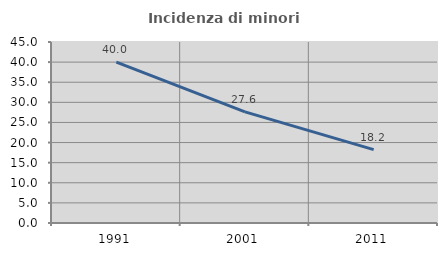
| Category | Incidenza di minori stranieri |
|---|---|
| 1991.0 | 40 |
| 2001.0 | 27.632 |
| 2011.0 | 18.235 |